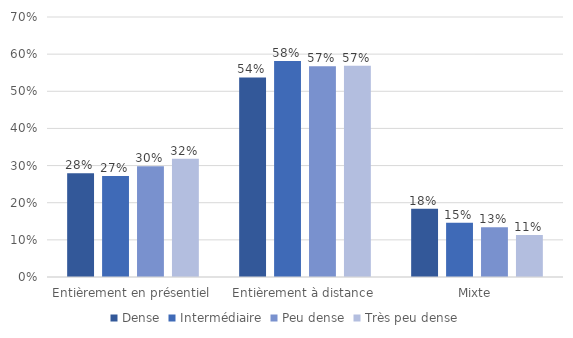
| Category | Dense | Intermédiaire | Peu dense | Très peu dense |
|---|---|---|---|---|
| Entièrement en présentiel | 0.279 | 0.272 | 0.298 | 0.318 |
| Entièrement à distance | 0.537 | 0.582 | 0.568 | 0.568 |
| Mixte | 0.183 | 0.146 | 0.134 | 0.113 |